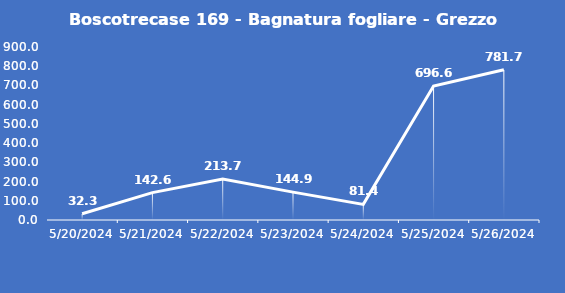
| Category | Boscotrecase 169 - Bagnatura fogliare - Grezzo (min) |
|---|---|
| 5/20/24 | 32.3 |
| 5/21/24 | 142.6 |
| 5/22/24 | 213.7 |
| 5/23/24 | 144.9 |
| 5/24/24 | 81.4 |
| 5/25/24 | 696.6 |
| 5/26/24 | 781.7 |